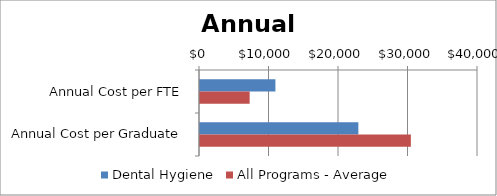
| Category | Dental Hygiene | All Programs - Average |
|---|---|---|
| Annual Cost per FTE | 10849.758 | 7144 |
| Annual Cost per Graduate | 22784.492 | 30340 |